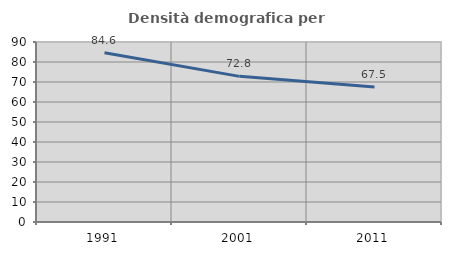
| Category | Densità demografica |
|---|---|
| 1991.0 | 84.612 |
| 2001.0 | 72.822 |
| 2011.0 | 67.482 |